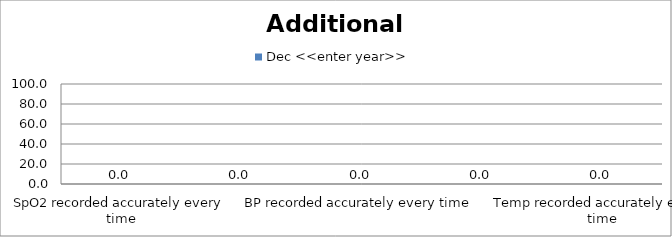
| Category | Dec <<enter year>> |
|---|---|
| SpO2 recorded accurately every time | 0 |
| CRT recorded accurately every time | 0 |
| BP recorded accurately every time | 0 |
| Skin Colour recorded accurately every time | 0 |
| Temp recorded accurately every time | 0 |